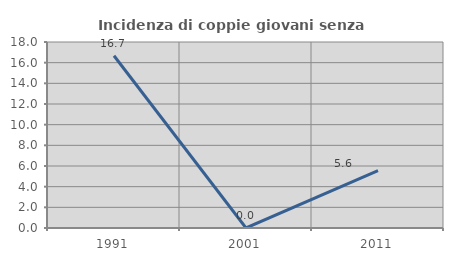
| Category | Incidenza di coppie giovani senza figli |
|---|---|
| 1991.0 | 16.667 |
| 2001.0 | 0 |
| 2011.0 | 5.556 |